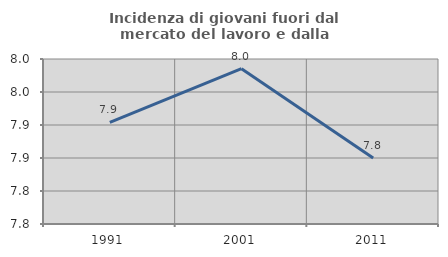
| Category | Incidenza di giovani fuori dal mercato del lavoro e dalla formazione  |
|---|---|
| 1991.0 | 7.904 |
| 2001.0 | 7.985 |
| 2011.0 | 7.85 |